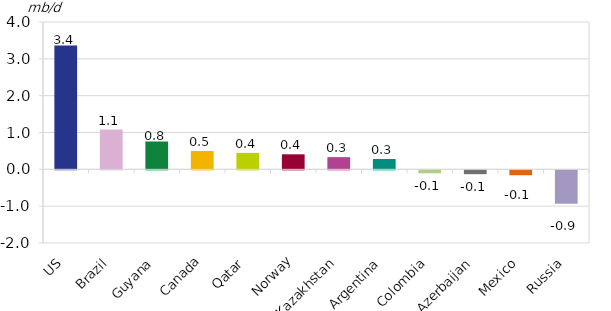
| Category | Series 0 |
|---|---|
| US | 3.361 |
| Brazil | 1.081 |
| Guyana | 0.756 |
| Canada | 0.497 |
| Qatar | 0.447 |
| Norway | 0.408 |
| Kazakhstan | 0.331 |
| Argentina | 0.281 |
| Colombia | -0.081 |
| Azerbaijan | -0.104 |
| Mexico | -0.133 |
| Russia | -0.907 |